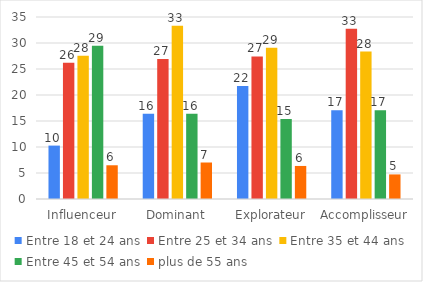
| Category | Entre 18 et 24 ans | Entre 25 et 34 ans | Entre 35 et 44 ans | Entre 45 et 54 ans | plus de 55 ans |
|---|---|---|---|---|---|
| Influenceur | 10.27 | 26.216 | 27.568 | 29.459 | 6.486 |
| Dominant | 16.374 | 26.901 | 33.333 | 16.374 | 7.018 |
| Explorateur | 21.739 | 27.425 | 29.097 | 15.385 | 6.355 |
| Accomplisseur | 17.091 | 32.727 | 28.364 | 17.091 | 4.727 |